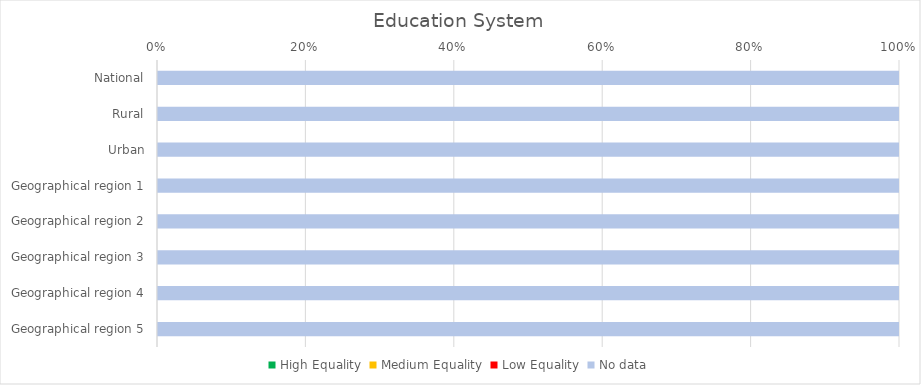
| Category | High Equality | Medium Equality | Low Equality | No data |
|---|---|---|---|---|
| National | 0 | 0 | 0 | 4 |
| Rural | 0 | 0 | 0 | 4 |
| Urban | 0 | 0 | 0 | 4 |
| Geographical region 1 | 0 | 0 | 0 | 4 |
| Geographical region 2 | 0 | 0 | 0 | 4 |
| Geographical region 3 | 0 | 0 | 0 | 4 |
| Geographical region 4 | 0 | 0 | 0 | 4 |
| Geographical region 5 | 0 | 0 | 0 | 4 |